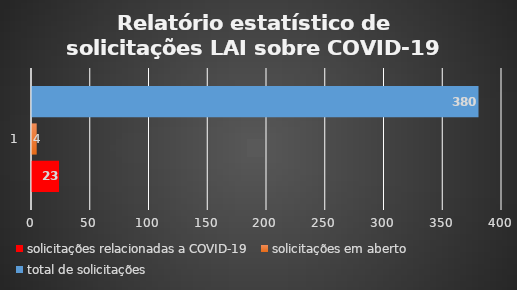
| Category | solicitações relacionadas a COVID-19 | solicitações em aberto | total de solicitações |
|---|---|---|---|
| 0 | 23 | 4 | 380 |